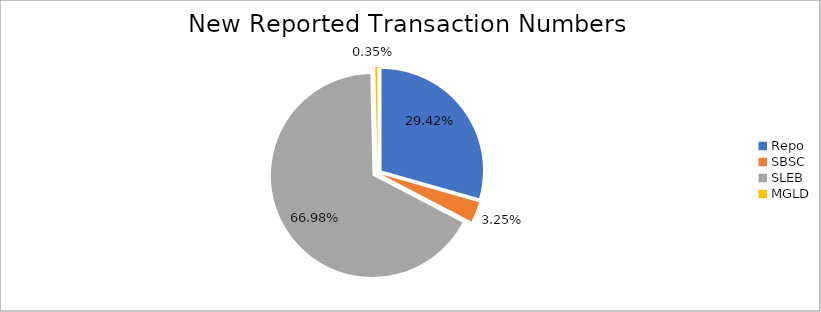
| Category | Series 0 |
|---|---|
| Repo | 398250 |
| SBSC | 43969 |
| SLEB | 906706 |
| MGLD | 4692 |